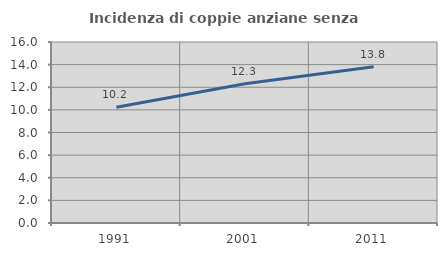
| Category | Incidenza di coppie anziane senza figli  |
|---|---|
| 1991.0 | 10.239 |
| 2001.0 | 12.308 |
| 2011.0 | 13.811 |